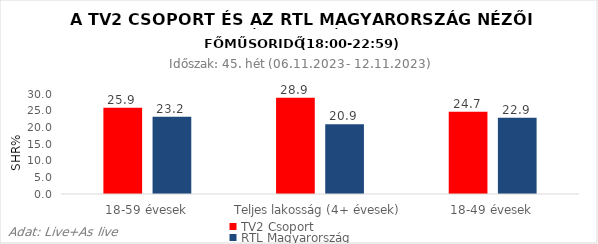
| Category | TV2 Csoport | RTL Magyarország |
|---|---|---|
| 18-59 évesek | 25.9 | 23.2 |
| Teljes lakosság (4+ évesek) | 28.9 | 20.9 |
| 18-49 évesek | 24.7 | 22.9 |